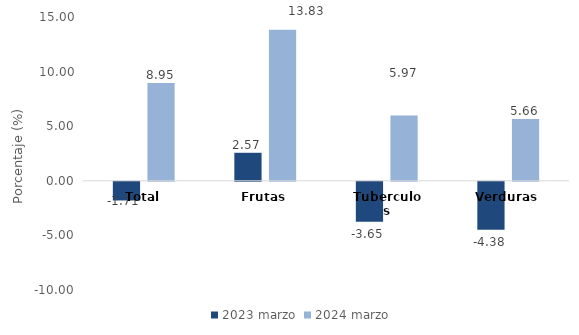
| Category | 2023 | 2024 |
|---|---|---|
| Total | -1.709 | 8.945 |
| Frutas | 2.567 | 13.831 |
| Tuberculos | -3.654 | 5.973 |
| Verduras | -4.384 | 5.662 |